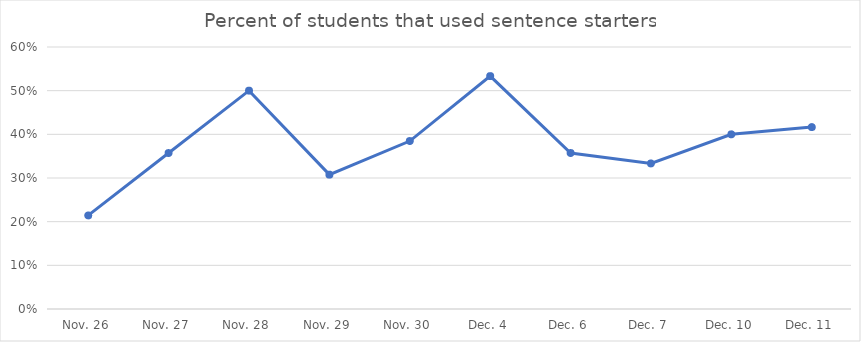
| Category | Percent of students that used sentence starters |
|---|---|
| Nov. 26 | 0.214 |
| Nov. 27 | 0.357 |
| Nov. 28 | 0.5 |
| Nov. 29 | 0.308 |
| Nov. 30 | 0.385 |
| Dec. 4 | 0.533 |
| Dec. 6 | 0.357 |
| Dec. 7 | 0.333 |
| Dec. 10 | 0.4 |
| Dec. 11 | 0.417 |